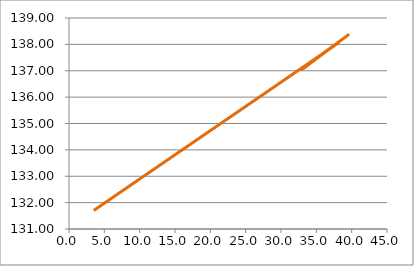
| Category | Series 0 |
|---|---|
| 3.49431 | 131.702 |
| 35.7316 | 137.617 |
| 35.7469 | 137.621 |
| 35.8918 | 137.649 |
| 36.1045 | 137.69 |
| 36.3463 | 137.737 |
| 36.5964 | 137.785 |
| 36.8451 | 137.833 |
| 37.089 | 137.88 |
| 37.3277 | 137.927 |
| 37.5619 | 137.972 |
| 37.7927 | 138.017 |
| 38.021 | 138.062 |
| 38.2474 | 138.107 |
| 38.4722 | 138.151 |
| 38.6957 | 138.195 |
| 38.918 | 138.239 |
| 39.139 | 138.283 |
| 33.3951 | 137.129 |
| 33.3951 | 137.129 |
| 33.3951 | 137.129 |